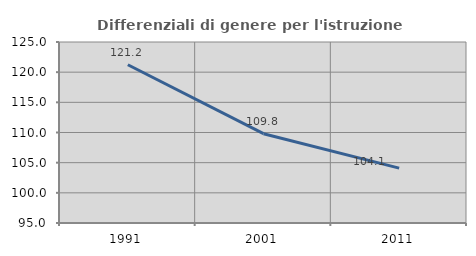
| Category | Differenziali di genere per l'istruzione superiore |
|---|---|
| 1991.0 | 121.231 |
| 2001.0 | 109.802 |
| 2011.0 | 104.103 |